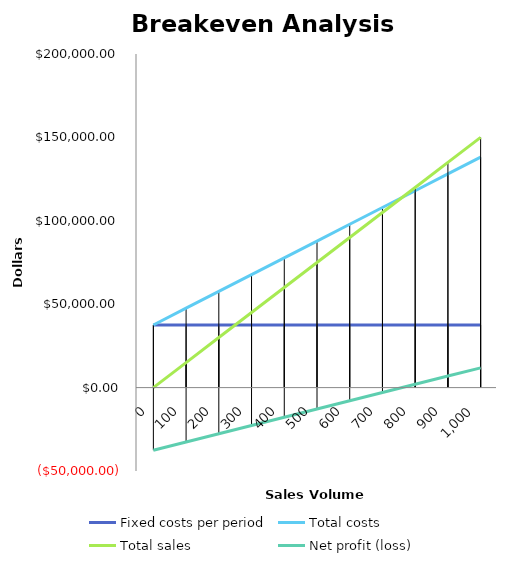
| Category | Fixed costs per period | Total costs | Total sales | Net profit (loss) |
|---|---|---|---|---|
| 0.0 | 37550 | 37550 | 0 | -37550 |
| 100.0 | 37550 | 47610 | 15000 | -32610 |
| 200.0 | 37550 | 57670 | 30000 | -27670 |
| 300.0 | 37550 | 67730 | 45000 | -22730 |
| 400.0 | 37550 | 77790 | 60000 | -17790 |
| 500.0 | 37550 | 87850 | 75000 | -12850 |
| 600.0 | 37550 | 97910 | 90000 | -7910 |
| 700.0 | 37550 | 107970 | 105000 | -2970 |
| 800.0 | 37550 | 118030 | 120000 | 1970 |
| 900.0 | 37550 | 128090 | 135000 | 6910 |
| 1000.0 | 37550 | 138150 | 150000 | 11850 |